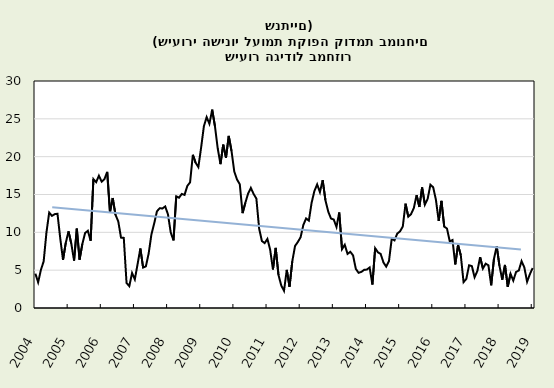
| Category | Series 0 |
|---|---|
| 2004-01-31 | 4.542 |
| 2004-02-29 | 3.397 |
| 2004-03-31 | 5.037 |
| 2004-04-30 | 6.167 |
| 2004-05-31 | 9.964 |
| 2004-06-30 | 12.613 |
| 2004-07-31 | 12.177 |
| 2004-08-31 | 12.403 |
| 2004-09-30 | 12.456 |
| 2004-10-31 | 9.209 |
| 2004-11-30 | 6.363 |
| 2004-12-31 | 8.608 |
| 2005-01-31 | 10.131 |
| 2005-02-28 | 8.508 |
| 2005-03-31 | 6.27 |
| 2005-04-30 | 10.488 |
| 2005-05-31 | 6.391 |
| 2005-06-30 | 8.464 |
| 2005-07-31 | 9.909 |
| 2005-08-31 | 10.209 |
| 2005-09-30 | 8.888 |
| 2005-10-31 | 17.037 |
| 2005-11-30 | 16.63 |
| 2005-12-31 | 17.481 |
| 2006-01-31 | 16.696 |
| 2006-02-28 | 17.025 |
| 2006-03-31 | 17.989 |
| 2006-04-30 | 12.664 |
| 2006-05-31 | 14.537 |
| 2006-06-30 | 12.312 |
| 2006-07-31 | 11.458 |
| 2006-08-31 | 9.302 |
| 2006-09-30 | 9.271 |
| 2006-10-31 | 3.307 |
| 2006-11-30 | 2.887 |
| 2006-12-31 | 4.624 |
| 2007-01-31 | 3.779 |
| 2007-02-28 | 5.798 |
| 2007-03-31 | 7.861 |
| 2007-04-30 | 5.342 |
| 2007-05-31 | 5.504 |
| 2007-06-30 | 7.187 |
| 2007-07-31 | 9.706 |
| 2007-08-31 | 11.159 |
| 2007-09-30 | 12.774 |
| 2007-10-31 | 13.185 |
| 2007-11-30 | 13.155 |
| 2007-12-31 | 13.42 |
| 2008-01-31 | 12.366 |
| 2008-02-29 | 9.974 |
| 2008-03-31 | 8.934 |
| 2008-04-30 | 14.767 |
| 2008-05-31 | 14.581 |
| 2008-06-30 | 15.076 |
| 2008-07-31 | 14.946 |
| 2008-08-31 | 16.132 |
| 2008-09-30 | 16.616 |
| 2008-10-31 | 20.249 |
| 2008-11-30 | 19.204 |
| 2008-12-31 | 18.621 |
| 2009-01-31 | 21.213 |
| 2009-02-28 | 24.023 |
| 2009-03-31 | 25.228 |
| 2009-04-30 | 24.343 |
| 2009-05-31 | 26.21 |
| 2009-06-30 | 24.035 |
| 2009-07-31 | 21.107 |
| 2009-08-31 | 19.009 |
| 2009-09-30 | 21.588 |
| 2009-10-31 | 19.86 |
| 2009-11-30 | 22.742 |
| 2009-12-31 | 20.753 |
| 2010-01-31 | 18.025 |
| 2010-02-28 | 16.979 |
| 2010-03-31 | 16.343 |
| 2010-04-30 | 12.534 |
| 2010-05-31 | 13.894 |
| 2010-06-30 | 15.124 |
| 2010-07-31 | 15.87 |
| 2010-08-31 | 15.071 |
| 2010-09-30 | 14.457 |
| 2010-10-31 | 10.498 |
| 2010-11-30 | 8.852 |
| 2010-12-31 | 8.576 |
| 2011-01-31 | 9.126 |
| 2011-02-28 | 7.673 |
| 2011-03-31 | 5.098 |
| 2011-04-30 | 7.944 |
| 2011-05-31 | 4.363 |
| 2011-06-30 | 2.989 |
| 2011-07-31 | 2.266 |
| 2011-08-31 | 5.04 |
| 2011-09-30 | 2.81 |
| 2011-10-31 | 6.169 |
| 2011-11-30 | 8.198 |
| 2011-12-31 | 8.718 |
| 2012-01-31 | 9.347 |
| 2012-02-29 | 10.972 |
| 2012-03-31 | 11.836 |
| 2012-04-30 | 11.548 |
| 2012-05-31 | 13.915 |
| 2012-06-30 | 15.448 |
| 2012-07-31 | 16.332 |
| 2012-08-31 | 15.305 |
| 2012-09-30 | 16.896 |
| 2012-10-31 | 14.242 |
| 2012-11-30 | 12.753 |
| 2012-12-31 | 11.827 |
| 2013-01-31 | 11.696 |
| 2013-02-28 | 10.713 |
| 2013-03-31 | 12.627 |
| 2013-04-30 | 7.772 |
| 2013-05-31 | 8.356 |
| 2013-06-30 | 7.147 |
| 2013-07-31 | 7.427 |
| 2013-08-31 | 6.952 |
| 2013-09-30 | 5.168 |
| 2013-10-31 | 4.65 |
| 2013-11-30 | 4.77 |
| 2013-12-31 | 5.045 |
| 2014-01-31 | 5.08 |
| 2014-02-28 | 5.356 |
| 2014-03-31 | 3.1 |
| 2014-04-30 | 7.898 |
| 2014-05-31 | 7.36 |
| 2014-06-30 | 7.143 |
| 2014-07-31 | 6.02 |
| 2014-08-31 | 5.466 |
| 2014-09-30 | 6.199 |
| 2014-10-31 | 9.168 |
| 2014-11-30 | 8.936 |
| 2014-12-31 | 9.836 |
| 2015-01-31 | 10.129 |
| 2015-02-28 | 10.766 |
| 2015-03-31 | 13.786 |
| 2015-04-30 | 12.061 |
| 2015-05-31 | 12.414 |
| 2015-06-30 | 13.209 |
| 2015-07-31 | 14.922 |
| 2015-08-31 | 13.357 |
| 2015-09-30 | 15.931 |
| 2015-10-31 | 13.664 |
| 2015-11-30 | 14.43 |
| 2015-12-31 | 16.289 |
| 2016-01-31 | 15.96 |
| 2016-02-29 | 14.293 |
| 2016-03-31 | 11.501 |
| 2016-04-30 | 14.159 |
| 2016-05-31 | 10.746 |
| 2016-06-30 | 10.507 |
| 2016-07-31 | 8.81 |
| 2016-08-31 | 8.981 |
| 2016-09-30 | 5.757 |
| 2016-10-31 | 8.341 |
| 2016-11-30 | 6.966 |
| 2016-12-31 | 3.414 |
| 2017-01-31 | 3.839 |
| 2017-02-28 | 5.646 |
| 2017-03-31 | 5.539 |
| 2017-04-30 | 4.07 |
| 2017-05-31 | 4.891 |
| 2017-06-30 | 6.724 |
| 2017-07-31 | 5.216 |
| 2017-08-31 | 5.856 |
| 2017-09-30 | 5.642 |
| 2017-10-31 | 3.003 |
| 2017-11-30 | 6.474 |
| 2017-12-31 | 8.168 |
| 2018-01-31 | 5.566 |
| 2018-02-28 | 3.735 |
| 2018-03-31 | 5.692 |
| 2018-04-30 | 2.795 |
| 2018-05-31 | 4.522 |
| 2018-06-30 | 3.614 |
| 2018-07-31 | 4.761 |
| 2018-08-31 | 4.956 |
| 2018-09-30 | 6.193 |
| 2018-10-31 | 5.362 |
| 2018-11-30 | 3.468 |
| 2018-12-31 | 4.461 |
| 2019-01-31 | 5.275 |